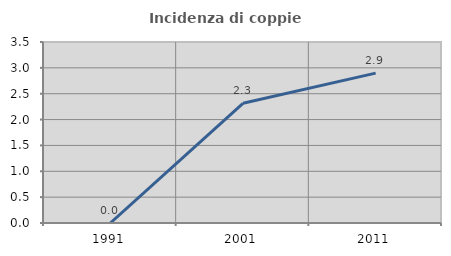
| Category | Incidenza di coppie miste |
|---|---|
| 1991.0 | 0 |
| 2001.0 | 2.314 |
| 2011.0 | 2.899 |